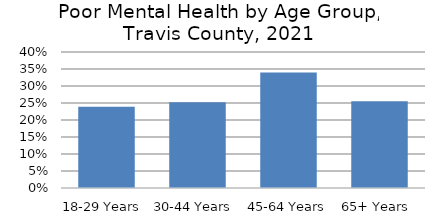
| Category | Series 0 |
|---|---|
| 18-29 Years  | 0.239 |
| 30-44 Years  | 0.252 |
| 45-64 Years | 0.34 |
| 65+ Years  | 0.255 |